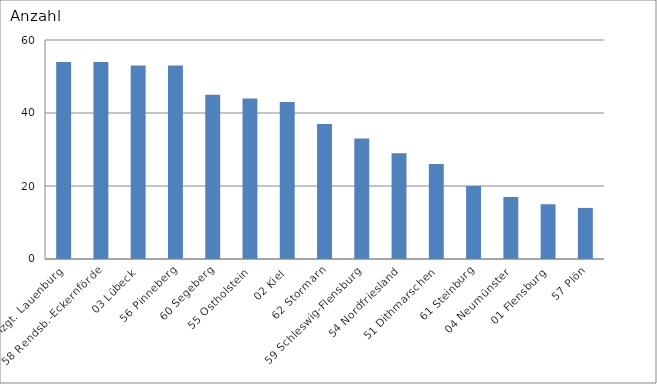
| Category | 53 Hzgt. Lauenburg |
|---|---|
| 53 Hzgt. Lauenburg | 54 |
| 58 Rendsb.-Eckernförde | 54 |
| 03 Lübeck | 53 |
| 56 Pinneberg | 53 |
| 60 Segeberg | 45 |
| 55 Ostholstein | 44 |
| 02 Kiel | 43 |
| 62 Stormarn | 37 |
| 59 Schleswig-Flensburg | 33 |
| 54 Nordfriesland | 29 |
| 51 Dithmarschen | 26 |
| 61 Steinburg | 20 |
| 04 Neumünster | 17 |
| 01 Flensburg | 15 |
| 57 Plön | 14 |